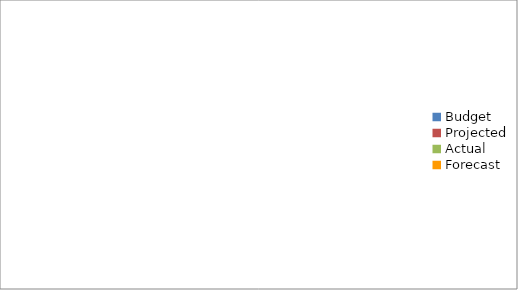
| Category | Series 0 |
|---|---|
| Budget | 2660 |
| Projected | 960 |
| Actual | 500 |
| Forecast | 570 |